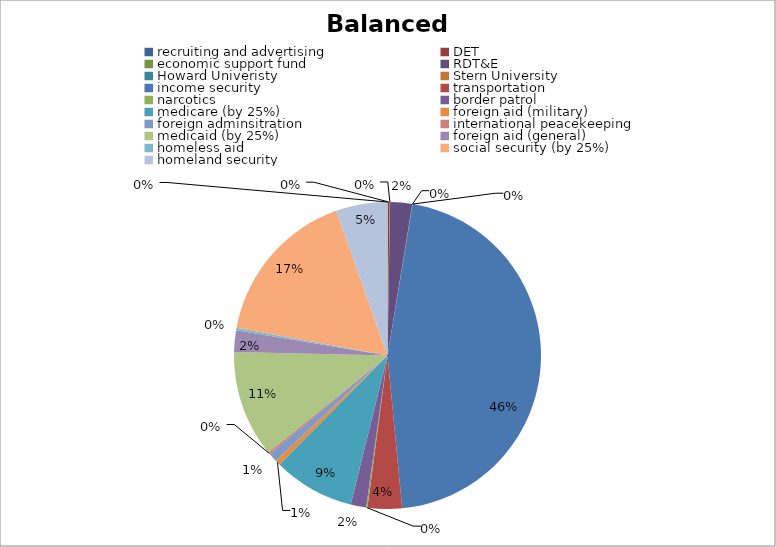
| Category | Series 0 |
|---|---|
| recruiting and advertising  | 0.486 |
| DET | 2.03 |
| economic support fund | 0.458 |
| RDT&E | 25.703 |
| Howard Univeristy | 0.234 |
| Stern University | 0.118 |
| income security | 507 |
| transportation | 40 |
| narcotics | 1.474 |
| border patrol | 18 |
| medicare (by 25%) | 95 |
| foreign aid (military) | 6 |
| foreign adminsitration | 10 |
| international peacekeeping | 2.5 |
| medicaid (by 25%)  | 124.5 |
| foreign aid (general) | 25 |
| homeless aid | 2.8 |
| social security (by 25%)  | 184.5 |
| homeland security  | 60 |